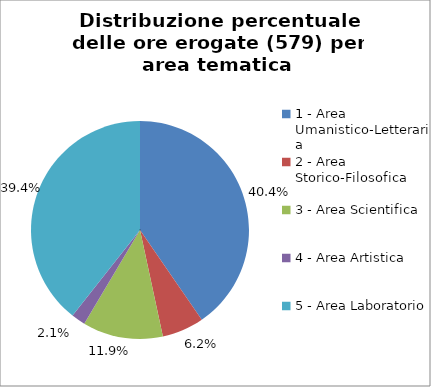
| Category | Nr. Ore Erogate |
|---|---|
| 1 - Area Umanistico-Letteraria | 234 |
| 2 - Area Storico-Filosofica | 36 |
| 3 - Area Scientifica | 69 |
| 4 - Area Artistica | 12 |
| 5 - Area Laboratorio | 228 |